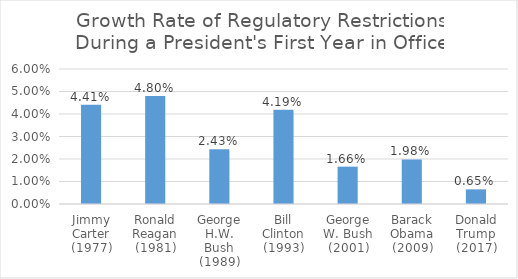
| Category | Growth Rate of Regulatory Restrictions During A President's First Year in Office |
|---|---|
| Jimmy Carter (1977) | 0.044 |
| Ronald Reagan (1981) | 0.048 |
| George H.W. Bush (1989) | 0.024 |
| Bill Clinton (1993) | 0.042 |
| George W. Bush (2001) | 0.017 |
| Barack Obama (2009) | 0.02 |
| Donald Trump (2017) | 0.007 |